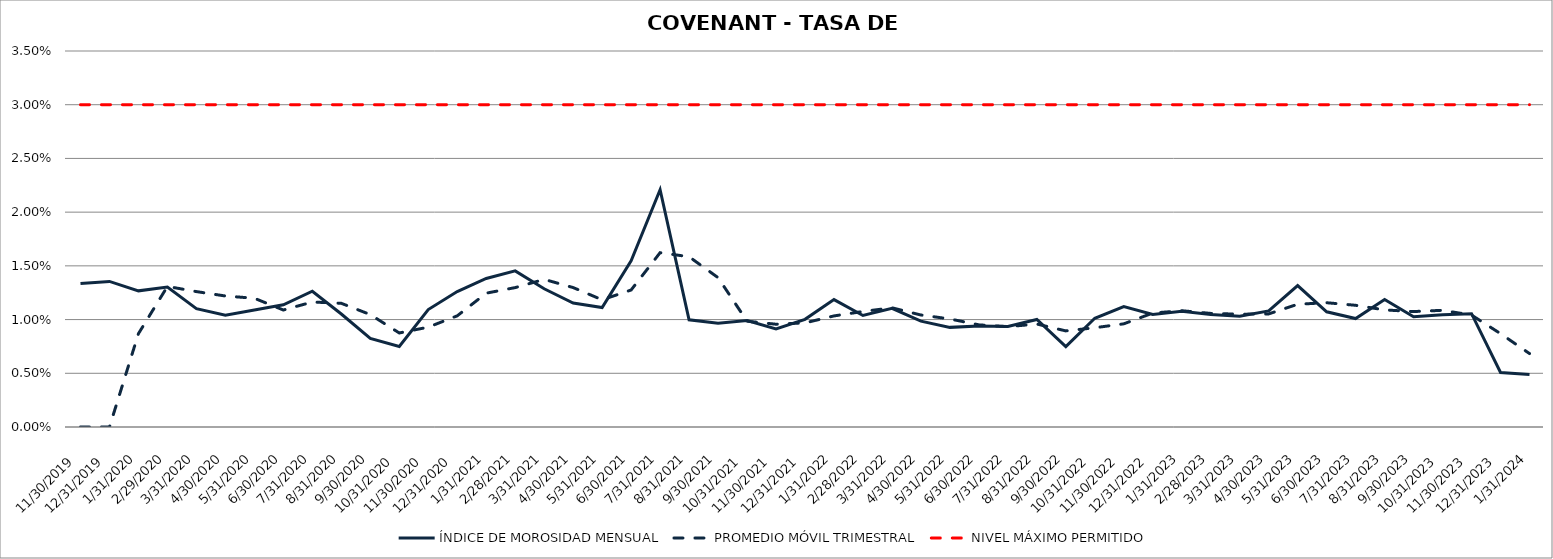
| Category | ÍNDICE DE MOROSIDAD MENSUAL | PROMEDIO MÓVIL TRIMESTRAL | NIVEL MÁXIMO PERMITIDO |
|---|---|---|---|
| 11/30/19 | 0.013 | 0 | 0.03 |
| 12/31/19 | 0.014 | 0 | 0.03 |
| 1/31/20 | 0.013 | 0.009 | 0.03 |
| 2/29/20 | 0.013 | 0.013 | 0.03 |
| 3/31/20 | 0.011 | 0.013 | 0.03 |
| 4/30/20 | 0.01 | 0.012 | 0.03 |
| 5/31/20 | 0.011 | 0.012 | 0.03 |
| 6/30/20 | 0.011 | 0.011 | 0.03 |
| 7/31/20 | 0.013 | 0.012 | 0.03 |
| 8/31/20 | 0.011 | 0.012 | 0.03 |
| 9/30/20 | 0.008 | 0.01 | 0.03 |
| 10/31/20 | 0.007 | 0.009 | 0.03 |
| 11/30/20 | 0.011 | 0.009 | 0.03 |
| 12/31/20 | 0.013 | 0.01 | 0.03 |
| 1/31/21 | 0.014 | 0.012 | 0.03 |
| 2/28/21 | 0.015 | 0.013 | 0.03 |
| 3/31/21 | 0.013 | 0.014 | 0.03 |
| 4/30/21 | 0.012 | 0.013 | 0.03 |
| 5/31/21 | 0.011 | 0.012 | 0.03 |
| 6/30/21 | 0.015 | 0.013 | 0.03 |
| 7/31/21 | 0.022 | 0.016 | 0.03 |
| 8/31/21 | 0.01 | 0.016 | 0.03 |
| 9/30/21 | 0.01 | 0.014 | 0.03 |
| 10/31/21 | 0.01 | 0.01 | 0.03 |
| 11/30/21 | 0.009 | 0.01 | 0.03 |
| 12/31/21 | 0.01 | 0.01 | 0.03 |
| 1/31/22 | 0.012 | 0.01 | 0.03 |
| 2/28/22 | 0.01 | 0.011 | 0.03 |
| 3/31/22 | 0.011 | 0.011 | 0.03 |
| 4/30/22 | 0.01 | 0.01 | 0.03 |
| 5/31/22 | 0.009 | 0.01 | 0.03 |
| 6/30/22 | 0.009 | 0.01 | 0.03 |
| 7/31/22 | 0.009 | 0.009 | 0.03 |
| 8/31/22 | 0.01 | 0.01 | 0.03 |
| 9/30/22 | 0.007 | 0.009 | 0.03 |
| 10/31/22 | 0.01 | 0.009 | 0.03 |
| 11/30/22 | 0.011 | 0.01 | 0.03 |
| 12/31/22 | 0.01 | 0.011 | 0.03 |
| 1/31/23 | 0.011 | 0.011 | 0.03 |
| 2/28/23 | 0.01 | 0.011 | 0.03 |
| 3/31/23 | 0.01 | 0.01 | 0.03 |
| 4/30/23 | 0.011 | 0.011 | 0.03 |
| 5/31/23 | 0.013 | 0.011 | 0.03 |
| 6/30/23 | 0.011 | 0.012 | 0.03 |
| 7/31/23 | 0.01 | 0.011 | 0.03 |
| 8/31/23 | 0.012 | 0.011 | 0.03 |
| 9/30/23 | 0.01 | 0.011 | 0.03 |
| 10/31/23 | 0.01 | 0.011 | 0.03 |
| 11/30/23 | 0.011 | 0.01 | 0.03 |
| 12/31/23 | 0.005 | 0.009 | 0.03 |
| 1/31/24 | 0.005 | 0.007 | 0.03 |